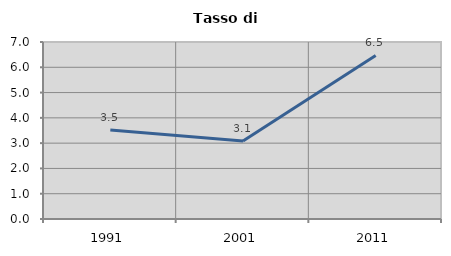
| Category | Tasso di disoccupazione   |
|---|---|
| 1991.0 | 3.516 |
| 2001.0 | 3.082 |
| 2011.0 | 6.469 |